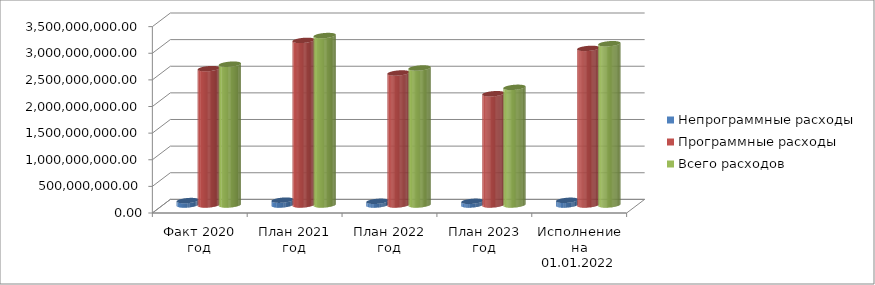
| Category | Непрограммные расходы | Программные расходы | Всего расходов |
|---|---|---|---|
| Факт 2020 год | 83148306 | 2561058133.41 | 2644206439.41 |
| План 2021 год | 90710246.41 | 3091684770.41 | 3182395016.82 |
| План 2022 год | 69635920 | 2479354316.09 | 2573350236.09 |
| План 2023 год | 69331020 | 2089976785.64 | 2209927805.64 |
| Исполнение на 01.01.2022 года | 88271042.59 | 2940800625.65 | 3029071668.24 |